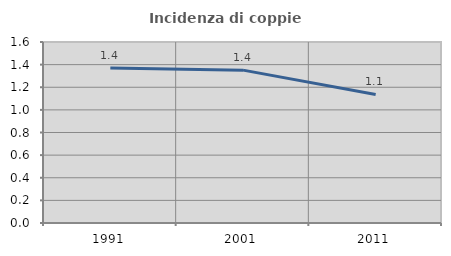
| Category | Incidenza di coppie miste |
|---|---|
| 1991.0 | 1.37 |
| 2001.0 | 1.351 |
| 2011.0 | 1.136 |